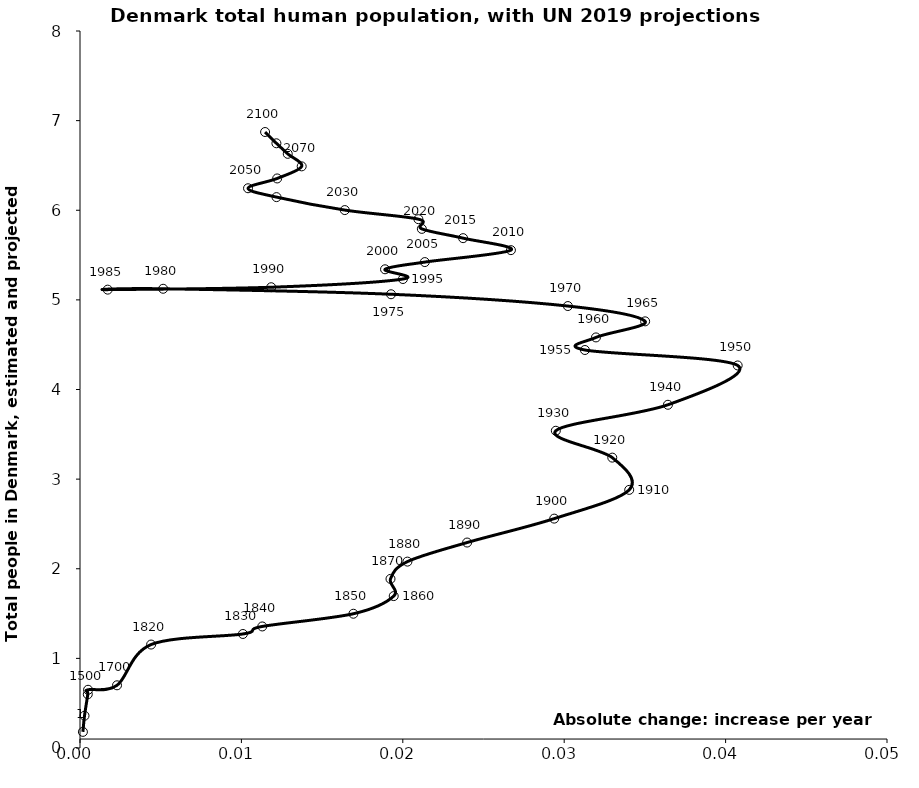
| Category | Series 0 |
|---|---|
| 0.0001800650521746284 | 0.18 |
| 0.0002800077629213201 | 0.36 |
| 0.0004830245024584408 | 0.6 |
| 0.0004996805197845938 | 0.65 |
| 0.0022939878408292716 | 0.7 |
| 0.004404875966716498 | 1.154 |
| 0.010093546499648786 | 1.272 |
| 0.011292779747131809 | 1.356 |
| 0.016939169620697737 | 1.498 |
| 0.019437572219620704 | 1.695 |
| 0.01923770001170687 | 1.887 |
| 0.020287029103254493 | 2.08 |
| 0.023984664949660495 | 2.293 |
| 0.029381214563334136 | 2.559 |
| 0.034028243397330835 | 2.88 |
| 0.03297891430578319 | 3.24 |
| 0.029481150667291046 | 3.54 |
| 0.036426709892296884 | 3.83 |
| 0.040748433091391395 | 4.268 |
| 0.03128300000000008 | 4.441 |
| 0.03196820000000038 | 4.581 |
| 0.03501399999999988 | 4.76 |
| 0.030226899999999546 | 4.931 |
| 0.0192704 | 5.063 |
| 0.005151400000000006 | 5.124 |
| 0.0017170000000002795 | 5.114 |
| 0.011846100000000259 | 5.141 |
| 0.0200078999999997 | 5.233 |
| 0.018899799999999977 | 5.341 |
| 0.021365000000000033 | 5.422 |
| 0.026699300000000026 | 5.555 |
| 0.023735799999999772 | 5.689 |
| 0.021179799999999638 | 5.792 |
| 0.020966500000000287 | 5.9 |
| 0.01640640000000039 | 6.002 |
| 0.012175349999999918 | 6.147 |
| 0.010410999999999903 | 6.245 |
| 0.012216199999999988 | 6.355 |
| 0.013735699999999795 | 6.49 |
| 0.012870950000000114 | 6.63 |
| 0.01216925000000022 | 6.747 |
| 0.011467550000000326 | 6.873 |